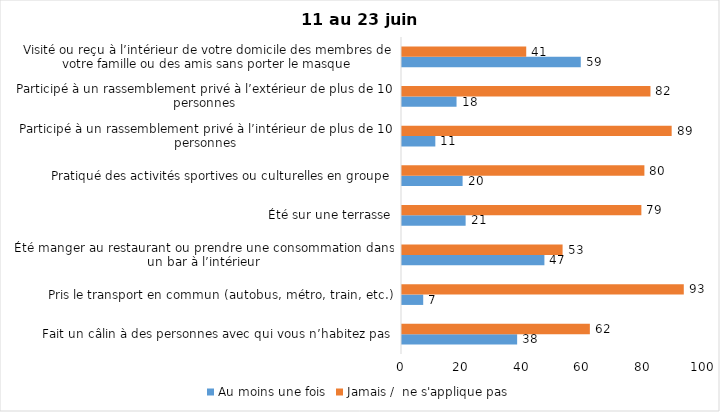
| Category | Au moins une fois | Jamais /  ne s'applique pas |
|---|---|---|
| Fait un câlin à des personnes avec qui vous n’habitez pas | 38 | 62 |
| Pris le transport en commun (autobus, métro, train, etc.) | 7 | 93 |
| Été manger au restaurant ou prendre une consommation dans un bar à l’intérieur | 47 | 53 |
| Été sur une terrasse | 21 | 79 |
| Pratiqué des activités sportives ou culturelles en groupe | 20 | 80 |
| Participé à un rassemblement privé à l’intérieur de plus de 10 personnes | 11 | 89 |
| Participé à un rassemblement privé à l’extérieur de plus de 10 personnes | 18 | 82 |
| Visité ou reçu à l’intérieur de votre domicile des membres de votre famille ou des amis sans porter le masque | 59 | 41 |